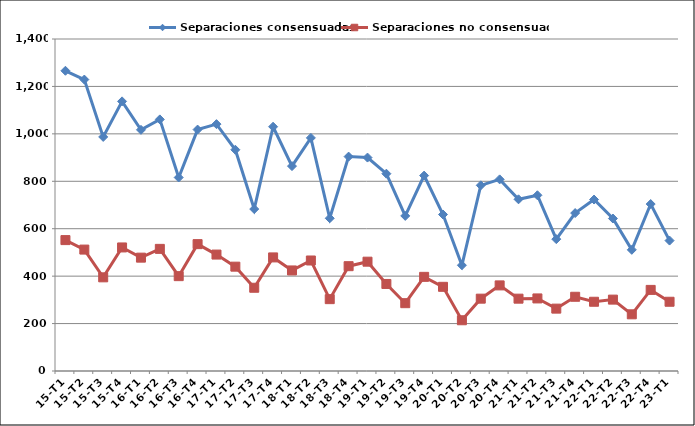
| Category | Separaciones consensuadas | Separaciones no consensuadas |
|---|---|---|
| 15-T1 | 1266 | 552 |
| 15-T2 | 1229 | 512 |
| 15-T3 | 987 | 395 |
| 15-T4 | 1137 | 521 |
| 16-T1 | 1017 | 478 |
| 16-T2 | 1061 | 515 |
| 16-T3 | 816 | 400 |
| 16-T4 | 1018 | 535 |
| 17-T1 | 1041 | 491 |
| 17-T2 | 933 | 440 |
| 17-T3 | 683 | 351 |
| 17-T4 | 1030 | 479 |
| 18-T1 | 864 | 424 |
| 18-T2 | 983 | 466 |
| 18-T3 | 644 | 303 |
| 18-T4 | 904 | 442 |
| 19-T1 | 900 | 461 |
| 19-T2 | 832 | 367 |
| 19-T3 | 654 | 286 |
| 19-T4 | 824 | 397 |
| 20-T1 | 660 | 355 |
| 20-T2 | 446 | 214 |
| 20-T3 | 783 | 305 |
| 20-T4 | 808 | 361 |
| 21-T1 | 724 | 305 |
| 21-T2 | 741 | 306 |
| 21-T3 | 556 | 263 |
| 21-T4 | 666 | 313 |
| 22-T1 | 723 | 292 |
| 22-T2 | 643 | 301 |
| 22-T3 | 511 | 239 |
| 22-T4 | 704 | 342 |
| 23-T1 | 550 | 292 |